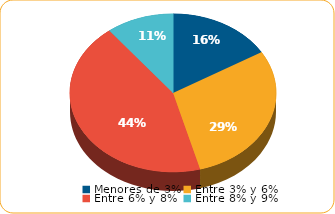
| Category | Series 0 |
|---|---|
| Menores de 3% | 2068.8 |
| Entre 3% y 6% | 3711.4 |
| Entre 6% y 8% | 5509.4 |
| Entre 8% y 9% | 1337.8 |